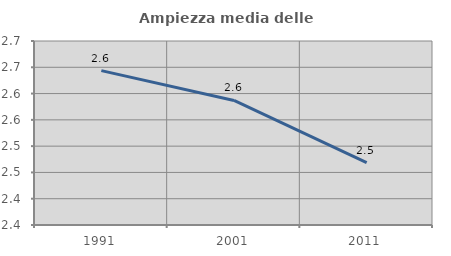
| Category | Ampiezza media delle famiglie |
|---|---|
| 1991.0 | 2.644 |
| 2001.0 | 2.587 |
| 2011.0 | 2.469 |